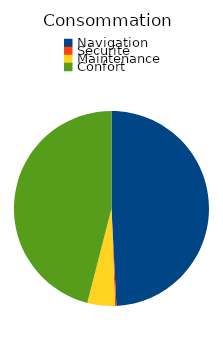
| Category | Series 0 |
|---|---|
| Navigation | 215 |
| Sécurité | 1 |
| Maintenance | 20 |
| Confort | 201 |